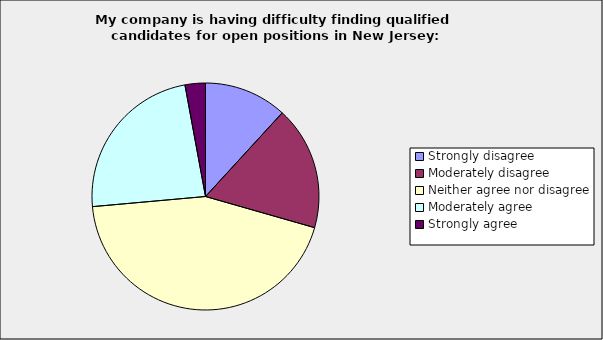
| Category | Series 0 |
|---|---|
| Strongly disagree | 0.118 |
| Moderately disagree | 0.176 |
| Neither agree nor disagree | 0.441 |
| Moderately agree | 0.235 |
| Strongly agree | 0.029 |